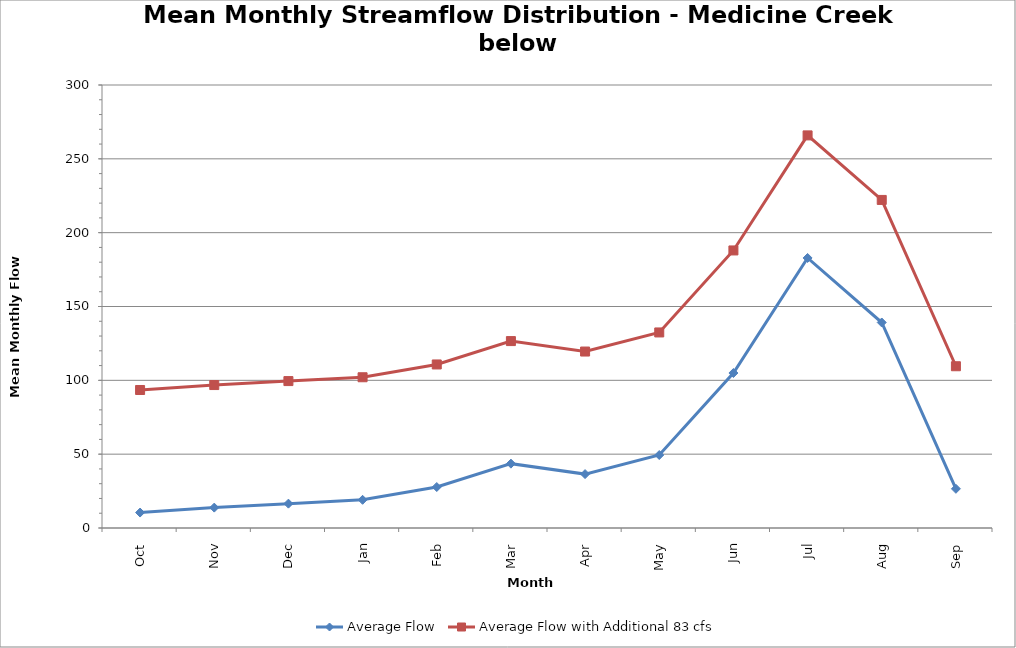
| Category | Average Flow | Average Flow with Additional 83 cfs |
|---|---|---|
| Oct | 10.458 | 93.458 |
| Nov | 13.806 | 96.806 |
| Dec | 16.495 | 99.495 |
| Jan | 19.087 | 102.087 |
| Feb | 27.753 | 110.753 |
| Mar | 43.58 | 126.58 |
| Apr | 36.495 | 119.495 |
| May | 49.429 | 132.429 |
| Jun | 104.96 | 187.96 |
| Jul | 182.874 | 265.874 |
| Aug | 139.166 | 222.166 |
| Sep | 26.542 | 109.542 |